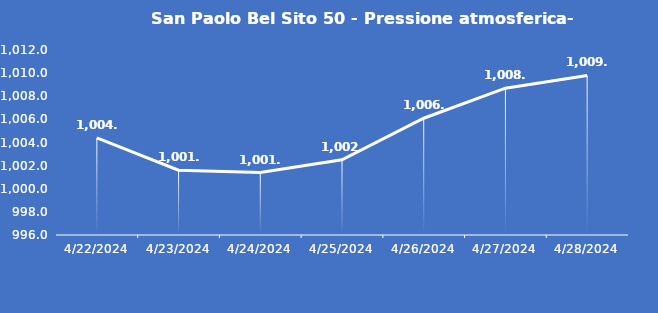
| Category | San Paolo Bel Sito 50 - Pressione atmosferica- Grezzo (hPa) |
|---|---|
| 4/22/24 | 1004.4 |
| 4/23/24 | 1001.6 |
| 4/24/24 | 1001.4 |
| 4/25/24 | 1002.5 |
| 4/26/24 | 1006.1 |
| 4/27/24 | 1008.7 |
| 4/28/24 | 1009.8 |